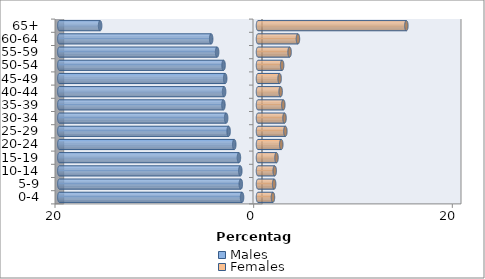
| Category | Males | Females |
|---|---|---|
| 0-4 | -1.605 | 1.506 |
| 5-9 | -1.73 | 1.626 |
| 10-14 | -1.782 | 1.682 |
| 15-19 | -1.921 | 1.861 |
| 20-24 | -2.39 | 2.343 |
| 25-29 | -2.959 | 2.756 |
| 30-34 | -3.207 | 2.67 |
| 35-39 | -3.482 | 2.549 |
| 40-44 | -3.411 | 2.281 |
| 45-49 | -3.303 | 2.177 |
| 50-54 | -3.466 | 2.43 |
| 55-59 | -4.116 | 3.181 |
| 60-64 | -4.714 | 4.021 |
| 65+ | -15.894 | 14.938 |